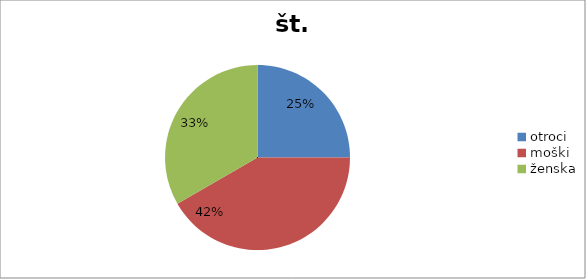
| Category | št. udelež |
|---|---|
| otroci | 27 |
| moški | 45 |
| ženska | 36 |